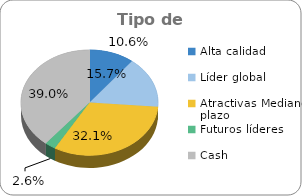
| Category | Series 0 |
|---|---|
| Alta calidad | 0.106 |
| Líder global | 0.157 |
| Atractivas Mediano plazo | 0.321 |
| Futuros líderes | 0.026 |
| Cash | 0.39 |